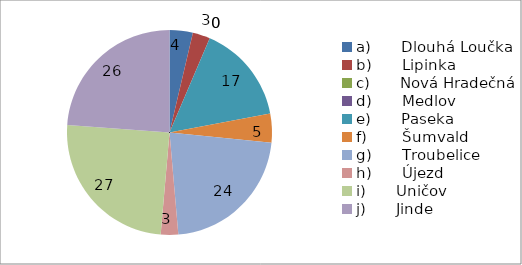
| Category | Series 0 |
|---|---|
| a)      Dlouhá Loučka | 4 |
| b)      Lipinka | 3 |
| c)      Nová Hradečná | 0 |
| d)      Medlov | 0 |
| e)      Paseka | 17 |
| f)       Šumvald | 5 |
| g)      Troubelice | 24 |
| h)      Újezd | 3 |
| i)      Uničov | 27 |
| j)      Jinde | 26 |